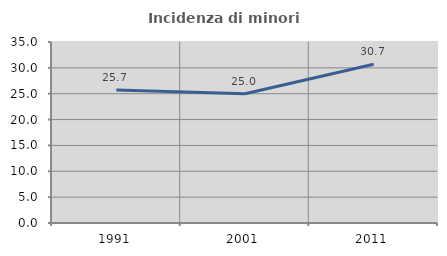
| Category | Incidenza di minori stranieri |
|---|---|
| 1991.0 | 25.714 |
| 2001.0 | 25 |
| 2011.0 | 30.682 |